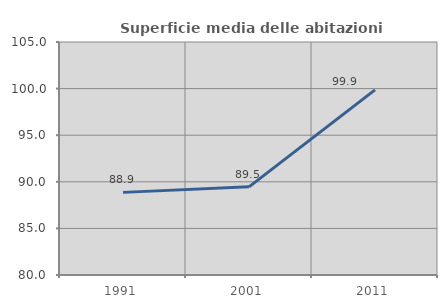
| Category | Superficie media delle abitazioni occupate |
|---|---|
| 1991.0 | 88.865 |
| 2001.0 | 89.457 |
| 2011.0 | 99.861 |